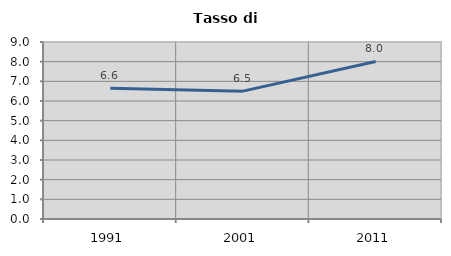
| Category | Tasso di disoccupazione   |
|---|---|
| 1991.0 | 6.645 |
| 2001.0 | 6.502 |
| 2011.0 | 8.011 |